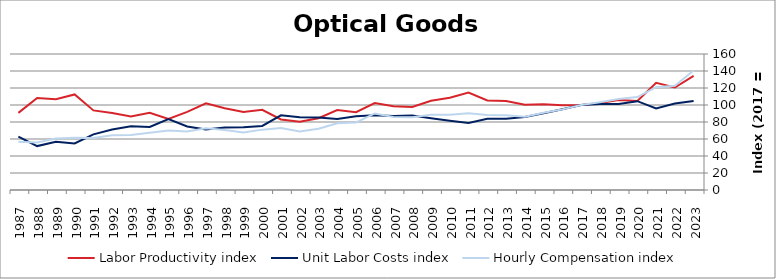
| Category | Labor Productivity index | Unit Labor Costs index | Hourly Compensation index |
|---|---|---|---|
| 2023.0 | 134.261 | 104.675 | 140.538 |
| 2022.0 | 120.613 | 101.681 | 122.641 |
| 2021.0 | 126.008 | 95.972 | 120.932 |
| 2020.0 | 104.622 | 104.483 | 109.312 |
| 2019.0 | 105.748 | 101.16 | 106.975 |
| 2018.0 | 102.263 | 101.035 | 103.322 |
| 2017.0 | 100 | 100 | 100 |
| 2016.0 | 99.706 | 95.114 | 94.834 |
| 2015.0 | 100.783 | 90.244 | 90.95 |
| 2014.0 | 100.179 | 85.961 | 86.115 |
| 2013.0 | 104.68 | 83.958 | 87.887 |
| 2012.0 | 105.241 | 83.71 | 88.097 |
| 2011.0 | 114.631 | 78.874 | 90.415 |
| 2010.0 | 108.537 | 81.538 | 88.499 |
| 2009.0 | 105.01 | 84.344 | 88.569 |
| 2008.0 | 97.617 | 87.541 | 85.455 |
| 2007.0 | 98.576 | 87.075 | 85.835 |
| 2006.0 | 102.293 | 88.032 | 90.05 |
| 2005.0 | 91.55 | 86.755 | 79.424 |
| 2004.0 | 94.05 | 83.537 | 78.566 |
| 2003.0 | 84.431 | 85.267 | 71.992 |
| 2002.0 | 80.199 | 85.726 | 68.752 |
| 2001.0 | 82.967 | 87.81 | 72.853 |
| 2000.0 | 94.3 | 75.317 | 71.024 |
| 1999.0 | 91.759 | 73.754 | 67.675 |
| 1998.0 | 96.255 | 73.388 | 70.64 |
| 1997.0 | 102.004 | 71.269 | 72.698 |
| 1996.0 | 91.934 | 74.793 | 68.76 |
| 1995.0 | 83.627 | 83.578 | 69.893 |
| 1994.0 | 90.771 | 74.12 | 67.28 |
| 1993.0 | 86.534 | 74.893 | 64.808 |
| 1992.0 | 90.468 | 71.226 | 64.436 |
| 1991.0 | 93.661 | 65.461 | 61.311 |
| 1990.0 | 112.402 | 54.808 | 61.605 |
| 1989.0 | 106.662 | 56.708 | 60.486 |
| 1988.0 | 108.232 | 51.67 | 55.924 |
| 1987.0 | 90.705 | 62.694 | 56.867 |